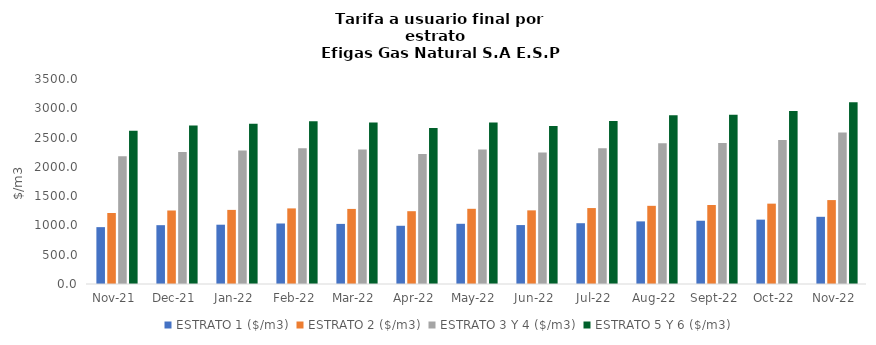
| Category | ESTRATO 1 ($/m3) | ESTRATO 2 ($/m3) | ESTRATO 3 Y 4 ($/m3) | ESTRATO 5 Y 6 ($/m3) |
|---|---|---|---|---|
| 2021-11-01 | 970.73 | 1211.98 | 2179.9 | 2615.88 |
| 2021-12-01 | 1004.32 | 1254.98 | 2255.58 | 2706.696 |
| 2022-01-01 | 1012.3 | 1265.26 | 2279.86 | 2735.832 |
| 2022-02-01 | 1033.14 | 1290.71 | 2316.99 | 2780.388 |
| 2022-03-01 | 1026.22 | 1281.91 | 2297.65 | 2757.18 |
| 2022-04-01 | 994.17 | 1242.89 | 2220 | 2664 |
| 2022-05-01 | 1028.01 | 1283.87 | 2296.99 | 2756.388 |
| 2022-06-01 | 1006.16 | 1257.23 | 2246.45 | 2695.74 |
| 2022-07-01 | 1037.88 | 1296.61 | 2319.21 | 2783.052 |
| 2022-08-01 | 1069.12 | 1334.67 | 2401.55 | 2881.86 |
| 2022-09-01 | 1080.05 | 1348.32 | 2407 | 2888.4 |
| 2022-10-01 | 1098.89 | 1371.9 | 2459.68 | 2951.616 |
| 2022-11-01 | 1147.2 | 1432.78 | 2584.83 | 3101.796 |